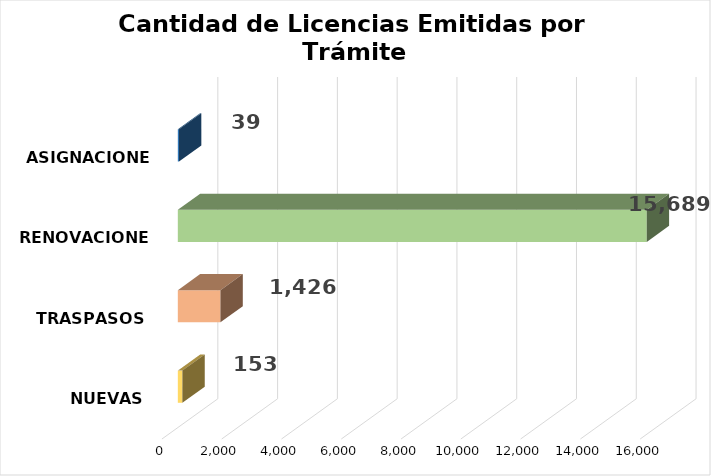
| Category | Series 0 |
|---|---|
| NUEVAS | 153 |
| TRASPASOS | 1426 |
| RENOVACIONES | 15689 |
| ASIGNACIONES | 39 |